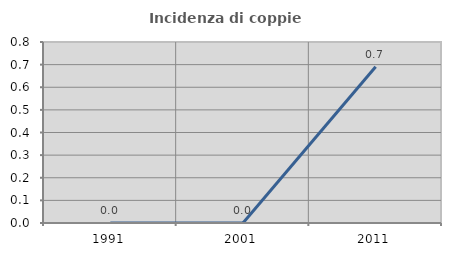
| Category | Incidenza di coppie miste |
|---|---|
| 1991.0 | 0 |
| 2001.0 | 0 |
| 2011.0 | 0.691 |